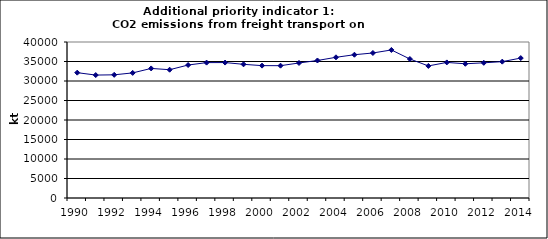
| Category | CO2 emissions from freight transport on road, kt  |
|---|---|
| 1990 | 32138.645 |
| 1991 | 31521.049 |
| 1992 | 31585.403 |
| 1993 | 32075.342 |
| 1994 | 33221.387 |
| 1995 | 32895.271 |
| 1996 | 34098.519 |
| 1997 | 34711.756 |
| 1998 | 34727.05 |
| 1999 | 34278.841 |
| 2000 | 33938.962 |
| 2001 | 33927.946 |
| 2002 | 34621.28 |
| 2003 | 35257.34 |
| 2004 | 36076.387 |
| 2005 | 36736.059 |
| 2006 | 37184.038 |
| 2007 | 37957.819 |
| 2008 | 35644.849 |
| 2009 | 33865.752 |
| 2010 | 34767.51 |
| 2011 | 34414.198 |
| 2012 | 34666.27 |
| 2013 | 34963.023 |
| 2014 | 35880.626 |